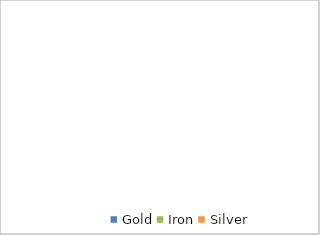
| Category | Series 0 |
|---|---|
| Gold | 0 |
| Iron | 0 |
| Silver | 0 |